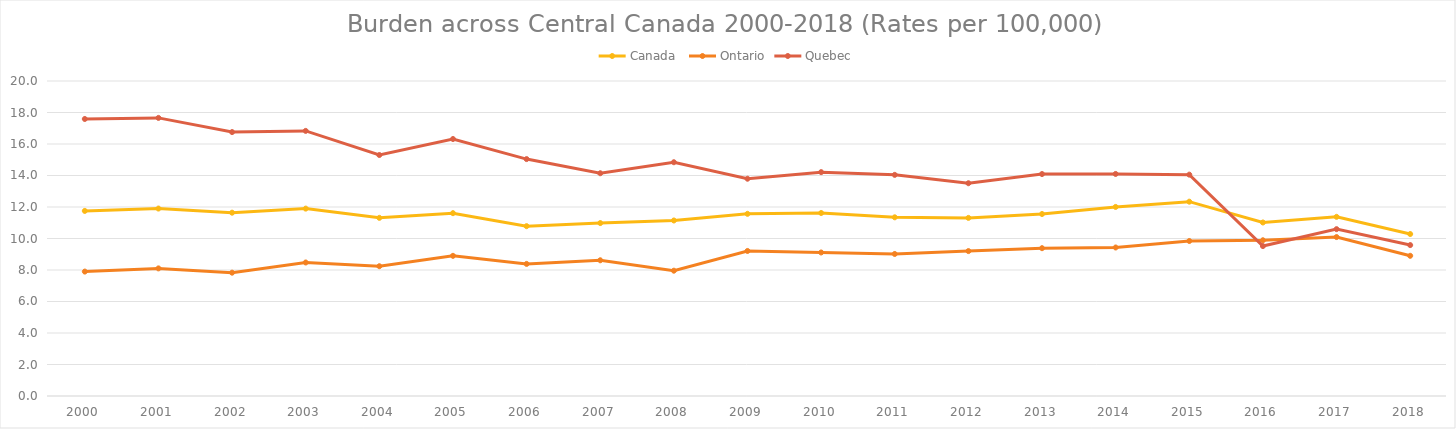
| Category | Canada  | Ontario | Quebec |
|---|---|---|---|
| 2000.0 | 11.751 | 7.9 | 17.589 |
| 2001.0 | 11.902 | 8.103 | 17.657 |
| 2002.0 | 11.639 | 7.83 | 16.757 |
| 2003.0 | 11.898 | 8.477 | 16.832 |
| 2004.0 | 11.312 | 8.24 | 15.301 |
| 2005.0 | 11.608 | 8.9 | 16.316 |
| 2006.0 | 10.783 | 8.387 | 15.042 |
| 2007.0 | 10.979 | 8.617 | 14.143 |
| 2008.0 | 11.144 | 7.956 | 14.842 |
| 2009.0 | 11.567 | 9.209 | 13.795 |
| 2010.0 | 11.619 | 9.113 | 14.213 |
| 2011.0 | 11.346 | 9.019 | 14.041 |
| 2012.0 | 11.309 | 9.2 | 13.509 |
| 2013.0 | 11.555 | 9.385 | 14.092 |
| 2014.0 | 12.004 | 9.429 | 14.098 |
| 2015.0 | 12.338 | 9.842 | 14.055 |
| 2016.0 | 11.016 | 9.888 | 9.519 |
| 2017.0 | 11.376 | 10.091 | 10.593 |
| 2018.0 | 10.284 | 8.902 | 9.582 |